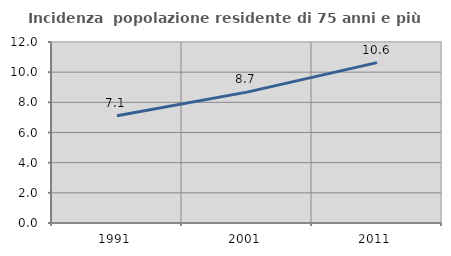
| Category | Incidenza  popolazione residente di 75 anni e più |
|---|---|
| 1991.0 | 7.113 |
| 2001.0 | 8.678 |
| 2011.0 | 10.635 |